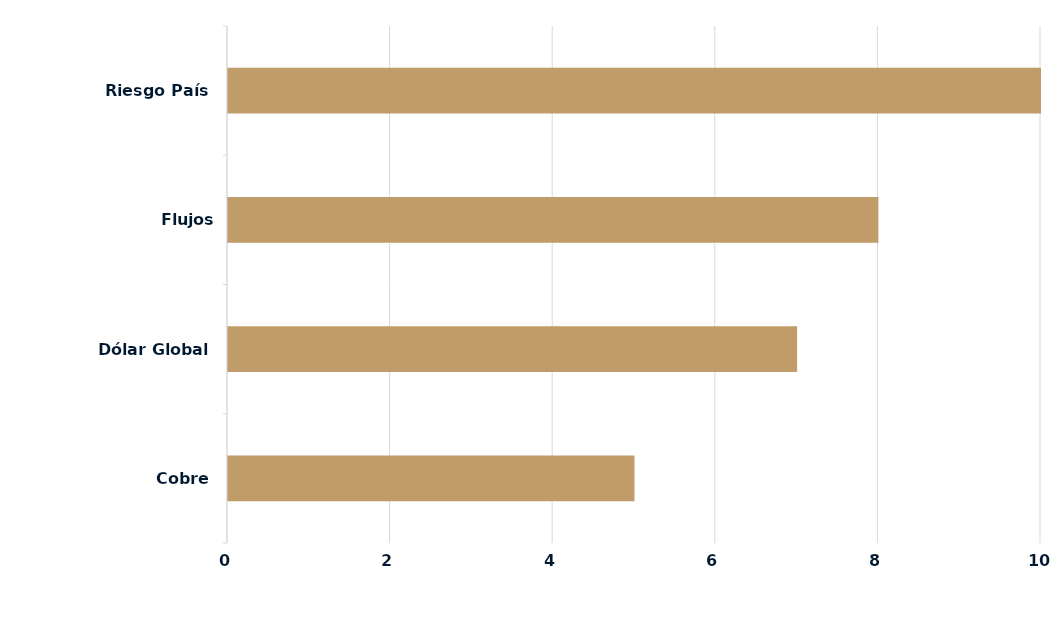
| Category | Series 0 |
|---|---|
| Cobre | 5 |
| Dólar Global | 7 |
| Flujos Locales/Extranjeros | 8 |
| Riesgo País | 10 |